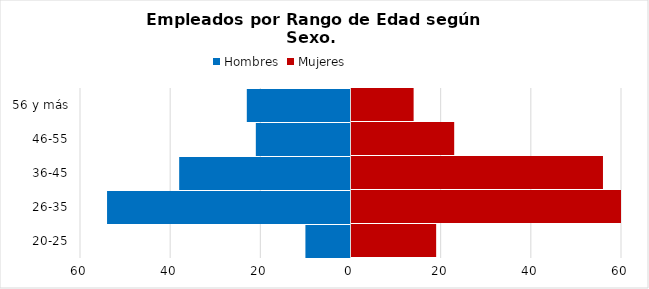
| Category | Hombres | Mujeres |
|---|---|---|
| 20-25 | -10 | 19 |
| 26-35 | -54 | 81 |
| 36-45 | -38 | 56 |
| 46-55 | -21 | 23 |
| 56 y más | -23 | 14 |